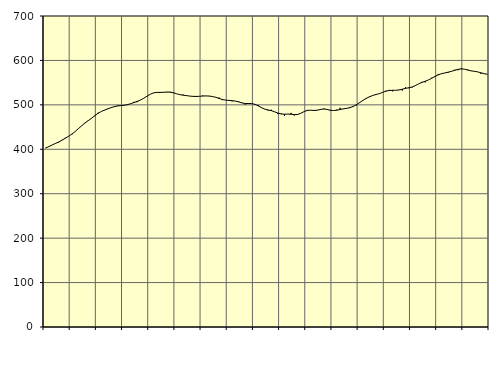
| Category | Piggar | Series 1 |
|---|---|---|
| nan | 403.5 | 402.73 |
| 87.0 | 405.9 | 406.19 |
| 87.0 | 409.8 | 409.79 |
| 87.0 | 413.7 | 413.06 |
| nan | 415.5 | 416.46 |
| 88.0 | 421 | 420.46 |
| 88.0 | 425.7 | 424.79 |
| 88.0 | 428.8 | 429.15 |
| nan | 433 | 434.12 |
| 89.0 | 439.9 | 439.92 |
| 89.0 | 445.8 | 446.35 |
| 89.0 | 452.6 | 452.87 |
| nan | 459.5 | 458.97 |
| 90.0 | 463.7 | 464.39 |
| 90.0 | 469.1 | 469.7 |
| 90.0 | 474.7 | 475.55 |
| nan | 482.1 | 480.97 |
| 91.0 | 485.1 | 485.08 |
| 91.0 | 487.8 | 488.24 |
| 91.0 | 491.6 | 490.96 |
| nan | 494 | 493.7 |
| 92.0 | 496.7 | 496.02 |
| 92.0 | 498.7 | 497.5 |
| 92.0 | 497.9 | 498.36 |
| nan | 499.4 | 499.01 |
| 93.0 | 501.4 | 500.41 |
| 93.0 | 502.6 | 502.66 |
| 93.0 | 506.8 | 505.19 |
| nan | 506 | 507.84 |
| 94.0 | 510.9 | 510.87 |
| 94.0 | 514.8 | 514.85 |
| 94.0 | 519.3 | 519.55 |
| nan | 523.8 | 523.92 |
| 95.0 | 527.2 | 526.95 |
| 95.0 | 528.5 | 528.04 |
| 95.0 | 527.2 | 528.06 |
| nan | 528.8 | 528.27 |
| 96.0 | 528.3 | 528.85 |
| 96.0 | 527.7 | 528.85 |
| 96.0 | 527.9 | 527.33 |
| nan | 524.9 | 525.05 |
| 97.0 | 522.8 | 523.05 |
| 97.0 | 523.1 | 521.8 |
| 97.0 | 520.1 | 520.84 |
| nan | 519.9 | 519.83 |
| 98.0 | 519.5 | 519.15 |
| 98.0 | 519.8 | 518.92 |
| 98.0 | 519.4 | 519.27 |
| nan | 521 | 519.86 |
| 99.0 | 520.1 | 520.12 |
| 99.0 | 520.1 | 519.74 |
| 99.0 | 518.5 | 518.73 |
| nan | 516.9 | 517.05 |
| 0.0 | 516.4 | 514.48 |
| 0.0 | 510.7 | 512.05 |
| 0.0 | 510.7 | 510.68 |
| nan | 509.5 | 510.07 |
| 1.0 | 507.9 | 509.49 |
| 1.0 | 508.3 | 508.45 |
| 1.0 | 507.6 | 506.61 |
| nan | 504.8 | 504.36 |
| 2.0 | 500.7 | 503.05 |
| 2.0 | 504.1 | 503.01 |
| 2.0 | 503 | 502.9 |
| nan | 501.4 | 501.14 |
| 3.0 | 499.9 | 497.73 |
| 3.0 | 493.1 | 493.64 |
| 3.0 | 490.2 | 490.32 |
| nan | 487.3 | 488.51 |
| 4.0 | 489 | 486.86 |
| 4.0 | 484.5 | 484.3 |
| 4.0 | 479.3 | 481.47 |
| nan | 480.4 | 479.39 |
| 5.0 | 475.2 | 478.99 |
| 5.0 | 479.1 | 479.24 |
| 5.0 | 481.9 | 478.86 |
| nan | 476 | 478.02 |
| 6.0 | 477.3 | 478.34 |
| 6.0 | 481.4 | 481.08 |
| 6.0 | 484.8 | 484.92 |
| nan | 488.6 | 487.45 |
| 7.0 | 488.1 | 487.93 |
| 7.0 | 486.2 | 487.42 |
| 7.0 | 487.4 | 487.97 |
| nan | 490.4 | 489.67 |
| 8.0 | 491.8 | 490.65 |
| 8.0 | 489.7 | 489.75 |
| 8.0 | 486.7 | 487.96 |
| nan | 487.2 | 487.19 |
| 9.0 | 489.3 | 487.94 |
| 9.0 | 493.4 | 489.54 |
| 9.0 | 491.4 | 490.95 |
| nan | 491.5 | 492.17 |
| 10.0 | 492.8 | 493.78 |
| 10.0 | 497.4 | 496.39 |
| 10.0 | 498.8 | 500.36 |
| nan | 505.9 | 505.27 |
| 11.0 | 509.9 | 510.27 |
| 11.0 | 513.7 | 514.67 |
| 11.0 | 519.4 | 518.27 |
| nan | 520.9 | 521.17 |
| 12.0 | 524.1 | 523.28 |
| 12.0 | 525.6 | 525.31 |
| 12.0 | 527.9 | 528.09 |
| nan | 531.9 | 530.78 |
| 13.0 | 533.7 | 532.31 |
| 13.0 | 530.5 | 532.76 |
| 13.0 | 532.8 | 532.8 |
| nan | 533.7 | 533.51 |
| 14.0 | 532.2 | 535.24 |
| 14.0 | 539.8 | 537.11 |
| 14.0 | 537.5 | 538.5 |
| nan | 539.2 | 540.14 |
| 15.0 | 544 | 543.39 |
| 15.0 | 547.4 | 547.43 |
| 15.0 | 551.7 | 550.53 |
| nan | 550.6 | 553.16 |
| 16.0 | 556 | 556.07 |
| 16.0 | 561.2 | 559.9 |
| 16.0 | 564.9 | 564 |
| nan | 569.6 | 567.54 |
| 17.0 | 569.7 | 570.16 |
| 17.0 | 571.6 | 571.8 |
| 17.0 | 572.2 | 573.5 |
| nan | 575.1 | 575.41 |
| 18.0 | 579.1 | 577.69 |
| 18.0 | 577.9 | 579.9 |
| 18.0 | 582.4 | 580.94 |
| nan | 580.5 | 580.33 |
| 19.0 | 579.5 | 578.3 |
| 19.0 | 576.6 | 576.55 |
| 19.0 | 575.4 | 575.51 |
| nan | 574.5 | 574.24 |
| 20.0 | 570 | 572.29 |
| 20.0 | 570.2 | 570.12 |
| 20.0 | 568.5 | 568.86 |